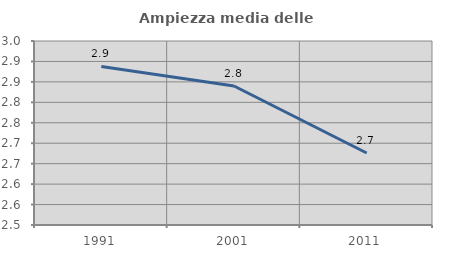
| Category | Ampiezza media delle famiglie |
|---|---|
| 1991.0 | 2.888 |
| 2001.0 | 2.84 |
| 2011.0 | 2.676 |